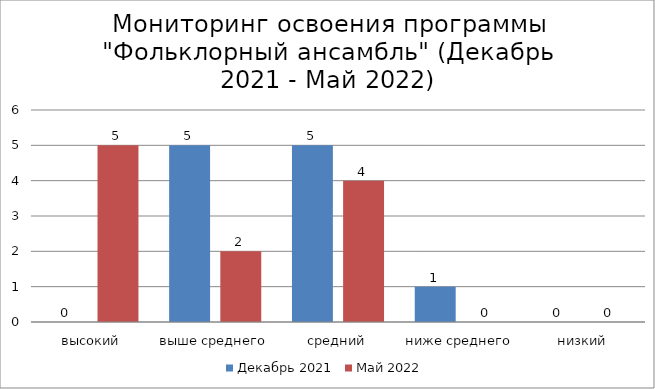
| Category | Декабрь 2021 | Май 2022 |
|---|---|---|
| высокий | 0 | 5 |
| выше среднего | 5 | 2 |
| средний | 5 | 4 |
| ниже среднего | 1 | 0 |
| низкий | 0 | 0 |